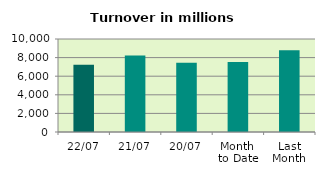
| Category | Series 0 |
|---|---|
| 22/07 | 7232.465 |
| 21/07 | 8216.297 |
| 20/07 | 7448.7 |
| Month 
to Date | 7534.787 |
| Last
Month | 8790.45 |